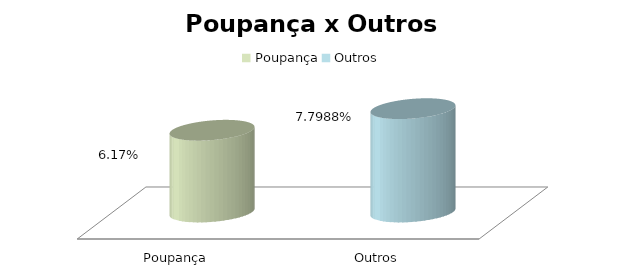
| Category | Series 0 |
|---|---|
| Poupança | 0.062 |
| Outros | 0.078 |